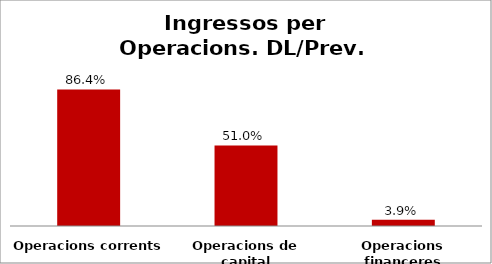
| Category | Series 0 |
|---|---|
| Operacions corrents | 0.864 |
| Operacions de capital | 0.51 |
| Operacions financeres | 0.039 |